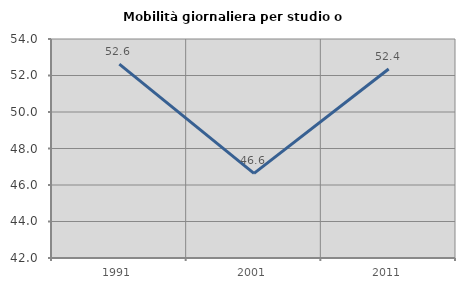
| Category | Mobilità giornaliera per studio o lavoro |
|---|---|
| 1991.0 | 52.624 |
| 2001.0 | 46.64 |
| 2011.0 | 52.357 |